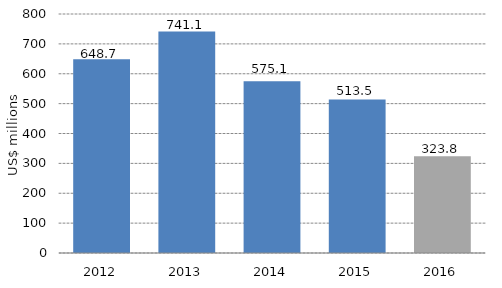
| Category | Series 0 |
|---|---|
| 2012.0 | 648.689 |
| 2013.0 | 741.098 |
| 2014.0 | 575.112 |
| 2015.0 | 513.471 |
| 2016.0 | 323.843 |